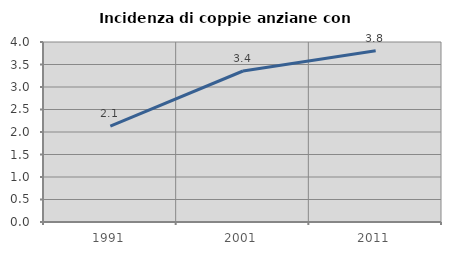
| Category | Incidenza di coppie anziane con figli |
|---|---|
| 1991.0 | 2.13 |
| 2001.0 | 3.355 |
| 2011.0 | 3.807 |